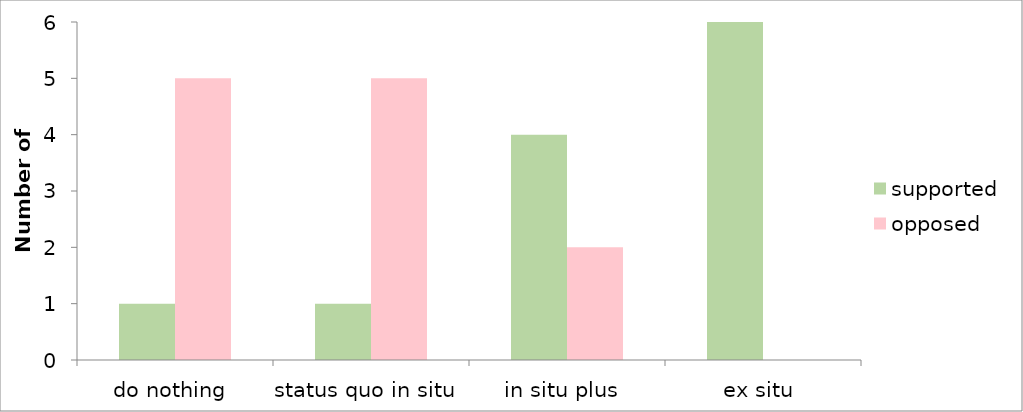
| Category | supported | opposed |
|---|---|---|
| do nothing | 1 | 5 |
| status quo in situ | 1 | 5 |
| in situ plus | 4 | 2 |
| ex situ | 6 | 0 |